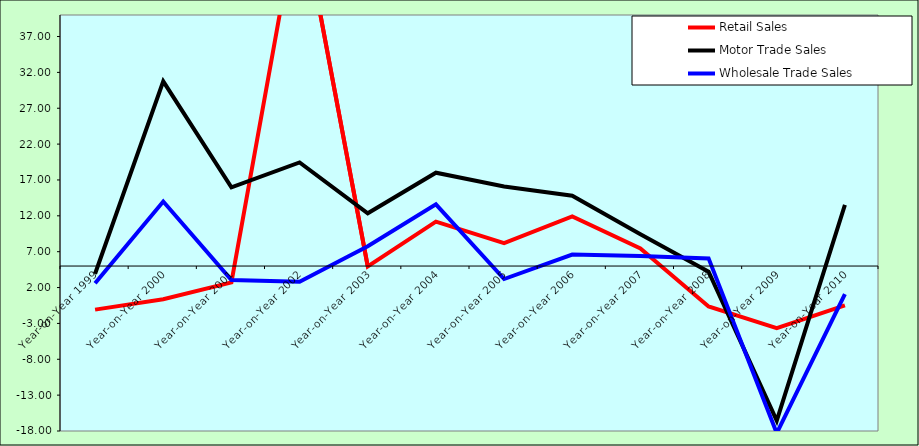
| Category | Retail Sales  | Motor Trade Sales | Wholesale Trade Sales |
|---|---|---|---|
| Year-on-Year 1999 | -1.078 | 3.926 | 2.607 |
| Year-on-Year 2000 | 0.366 | 30.745 | 14.002 |
| Year-on-Year 2001 | 2.729 | 15.974 | 3.059 |
| Year-on-Year 2002 | 55.46 | 19.436 | 2.812 |
| Year-on-Year 2003 | 4.946 | 12.357 | 7.751 |
| Year-on-Year 2004 | 11.189 | 18.014 | 13.601 |
| Year-on-Year 2005 | 8.186 | 16.102 | 3.189 |
| Year-on-Year 2006 | 11.92 | 14.81 | 6.608 |
| Year-on-Year 2007 | 7.463 | 9.422 | 6.409 |
| Year-on-Year 2008 | -0.639 | 4.207 | 6.066 |
| Year-on-Year 2009 | -3.655 | -16.555 | -18.301 |
| Year-on-Year 2010 | -0.493 | 13.513 | 1.083 |